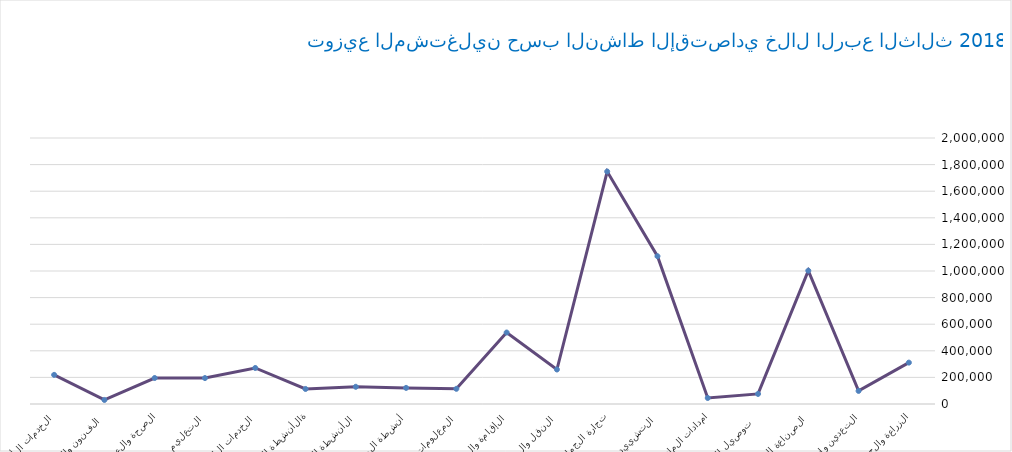
| Category | Series 0 |
|---|---|
| الزراعة والحراجة وصيد الأسماك | 311109 |
| التعدين واستغلال المحاجر | 98435 |
| الصناعة التحويلية | 1002351 |
| توصيل الكهرباء والغاز  | 75763 |
| امدادات الماء والصرف الصحي | 45233 |
| التشييد | 1111089 |
| تجارة الجملة والتجزئة | 1747892 |
| النقل والتخزين | 259402 |
| الإقامة والطعام | 537402 |
| المعلومات والاتصالات | 114283 |
| أنشطة المال والتأمين | 121102 |
| الأنشطة العقارية | 129440 |
| الأنشطة المهنية  | 113091 |
| الخدمات الإدارية والدعم | 270877 |
| التعليم | 194968 |
| الصحة والعمل الاجتماعي | 195415 |
| الفنون والترفية | 30458 |
| الخدمات الأخرى | 219024 |